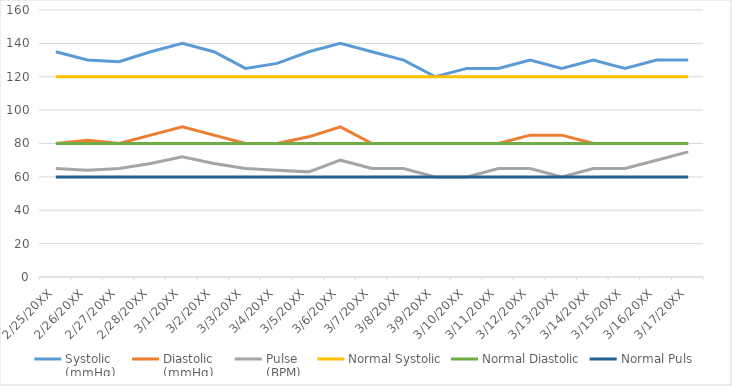
| Category | Systolic 
(mmHg) | Diastolic 
(mmHg) | Pulse 
(BPM) | Normal Systolic | Normal Diastolic | Normal Puls |
|---|---|---|---|---|---|---|
| 2/25/20XX | 135 | 80 | 65 | 120 | 80 | 60 |
| 2/26/20XX | 130 | 82 | 64 | 120 | 80 | 60 |
| 2/27/20XX | 129 | 80 | 65 | 120 | 80 | 60 |
| 2/28/20XX | 135 | 85 | 68 | 120 | 80 | 60 |
| 3/1/20XX | 140 | 90 | 72 | 120 | 80 | 60 |
| 3/2/20XX | 135 | 85 | 68 | 120 | 80 | 60 |
| 3/3/20XX | 125 | 80 | 65 | 120 | 80 | 60 |
| 3/4/20XX | 128 | 80 | 64 | 120 | 80 | 60 |
| 3/5/20XX | 135 | 84 | 63 | 120 | 80 | 60 |
| 3/6/20XX | 140 | 90 | 70 | 120 | 80 | 60 |
| 3/7/20XX | 135 | 80 | 65 | 120 | 80 | 60 |
| 3/8/20XX | 130 | 80 | 65 | 120 | 80 | 60 |
| 3/9/20XX | 120 | 80 | 60 | 120 | 80 | 60 |
| 3/10/20XX | 125 | 80 | 60 | 120 | 80 | 60 |
| 3/11/20XX | 125 | 80 | 65 | 120 | 80 | 60 |
| 3/12/20XX | 130 | 85 | 65 | 120 | 80 | 60 |
| 3/13/20XX | 125 | 85 | 60 | 120 | 80 | 60 |
| 3/14/20XX | 130 | 80 | 65 | 120 | 80 | 60 |
| 3/15/20XX | 125 | 80 | 65 | 120 | 80 | 60 |
| 3/16/20XX | 130 | 80 | 70 | 120 | 80 | 60 |
| 3/17/20XX | 130 | 80 | 75 | 120 | 80 | 60 |